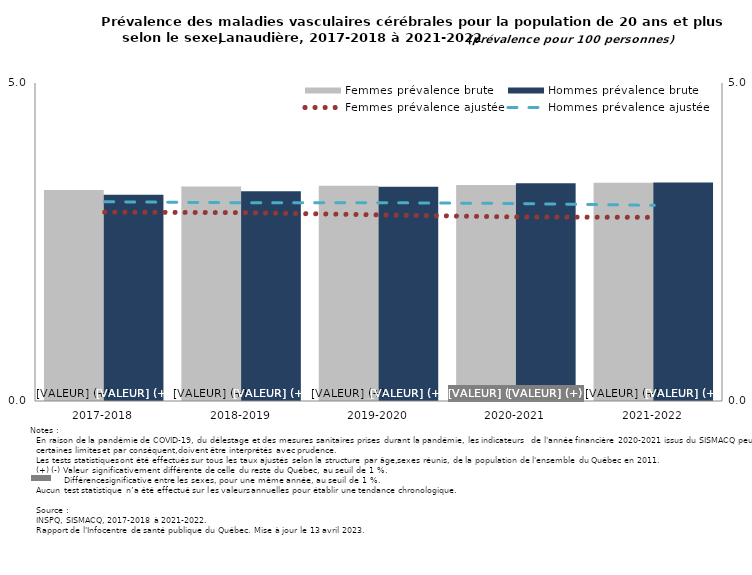
| Category | Femmes prévalence brute | Hommes prévalence brute |
|---|---|---|
| 2017-2018 | 3.319 | 3.242 |
| 2018-2019 | 3.371 | 3.297 |
| 2019-2020 | 3.386 | 3.369 |
| 2020-2021 | 3.395 | 3.423 |
| 2021-2022 | 3.431 | 3.435 |